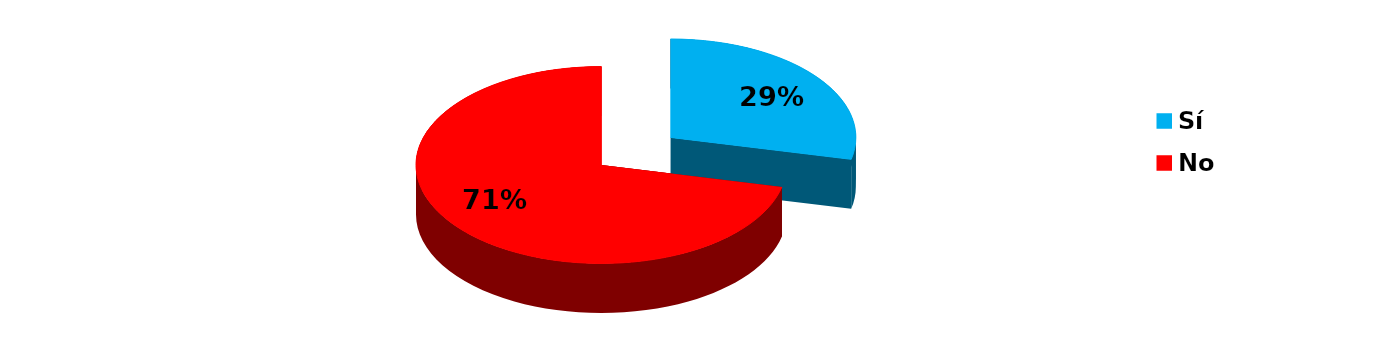
| Category | Series 0 |
|---|---|
| Sí | 2 |
| No | 5 |